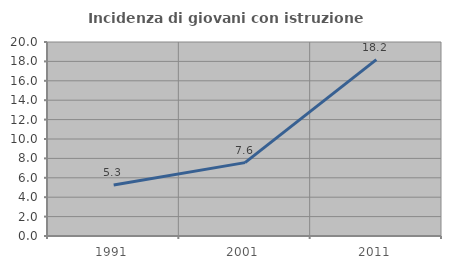
| Category | Incidenza di giovani con istruzione universitaria |
|---|---|
| 1991.0 | 5.263 |
| 2001.0 | 7.563 |
| 2011.0 | 18.182 |